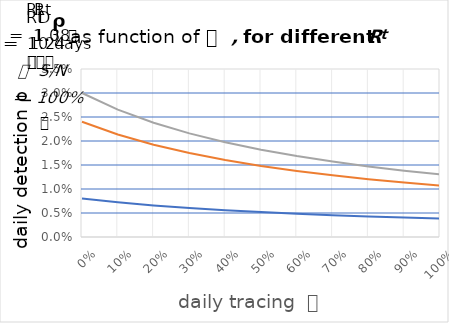
| Category | Series 0 | Series 1 | Series 2 |
|---|---|---|---|
| 0.0 | 0.008 | 0.024 | 0.03 |
| 0.1 | 0.007 | 0.021 | 0.027 |
| 0.2 | 0.007 | 0.019 | 0.024 |
| 0.30000000000000004 | 0.006 | 0.017 | 0.022 |
| 0.4 | 0.006 | 0.016 | 0.02 |
| 0.5 | 0.005 | 0.015 | 0.018 |
| 0.6 | 0.005 | 0.014 | 0.017 |
| 0.7 | 0.005 | 0.013 | 0.016 |
| 0.7999999999999999 | 0.004 | 0.012 | 0.015 |
| 0.8999999999999999 | 0.004 | 0.011 | 0.014 |
| 0.9999999999999999 | 0.004 | 0.011 | 0.013 |